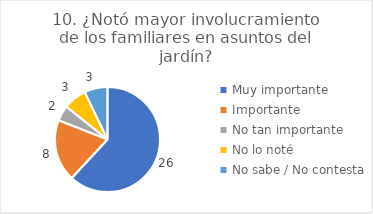
| Category | 10. ¿Notó mayor involucramiento de los familiares en asuntos del jardín? |
|---|---|
| Muy importante  | 0.619 |
| Importante  | 0.19 |
| No tan importante  | 0.048 |
| No lo noté  | 0.071 |
| No sabe / No contesta | 0.071 |